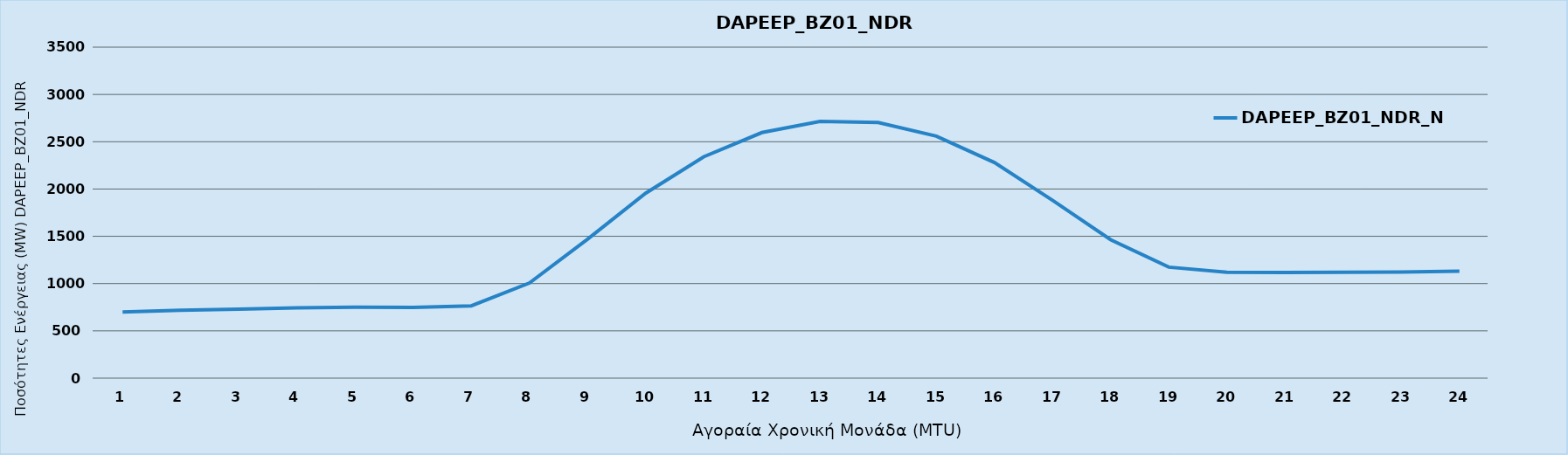
| Category | DAPEEP_BZ01_NDR_N1 |
|---|---|
| 0 | 699 |
| 1 | 718 |
| 2 | 729 |
| 3 | 743 |
| 4 | 750 |
| 5 | 748 |
| 6 | 765 |
| 7 | 1006 |
| 8 | 1470 |
| 9 | 1956 |
| 10 | 2341 |
| 11 | 2597 |
| 12 | 2715 |
| 13 | 2703 |
| 14 | 2559 |
| 15 | 2280 |
| 16 | 1881 |
| 17 | 1464 |
| 18 | 1174 |
| 19 | 1120 |
| 20 | 1118 |
| 21 | 1119 |
| 22 | 1123 |
| 23 | 1131 |